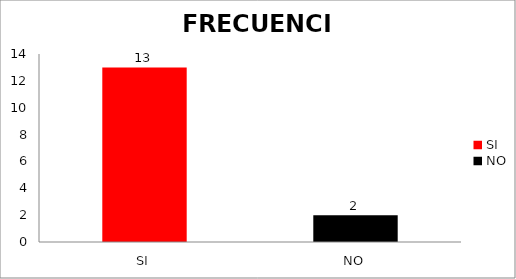
| Category | Series 0 |
|---|---|
| SI | 13 |
| NO | 2 |